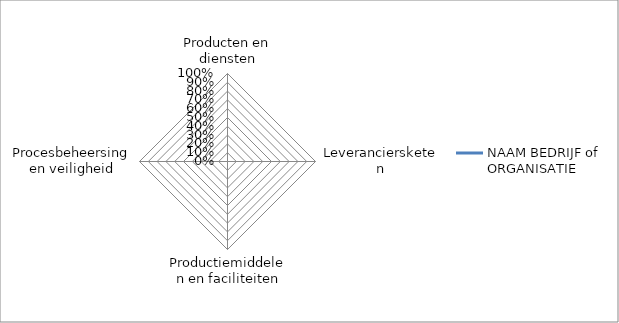
| Category | NAAM BEDRIJF of ORGANISATIE |
|---|---|
| Producten en diensten | 0 |
| Leveranciersketen | 0 |
| Productiemiddelen en faciliteiten | 0 |
| Procesbeheersing en veiligheid | 0 |